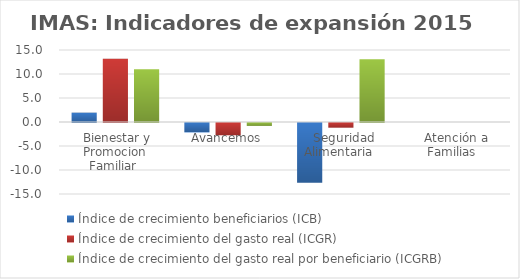
| Category | Índice de crecimiento beneficiarios (ICB)  | Índice de crecimiento del gasto real (ICGR)  | Índice de crecimiento del gasto real por beneficiario (ICGRB)  |
|---|---|---|---|
| Bienestar y Promocion Familiar | 1.948 | 13.17 | 11.008 |
| Avancemos | -1.965 | -2.561 | -0.608 |
| Seguridad Alimentaria | -12.443 | -0.978 | 13.093 |
| Atención a Familias | 0 | 0 | 0 |